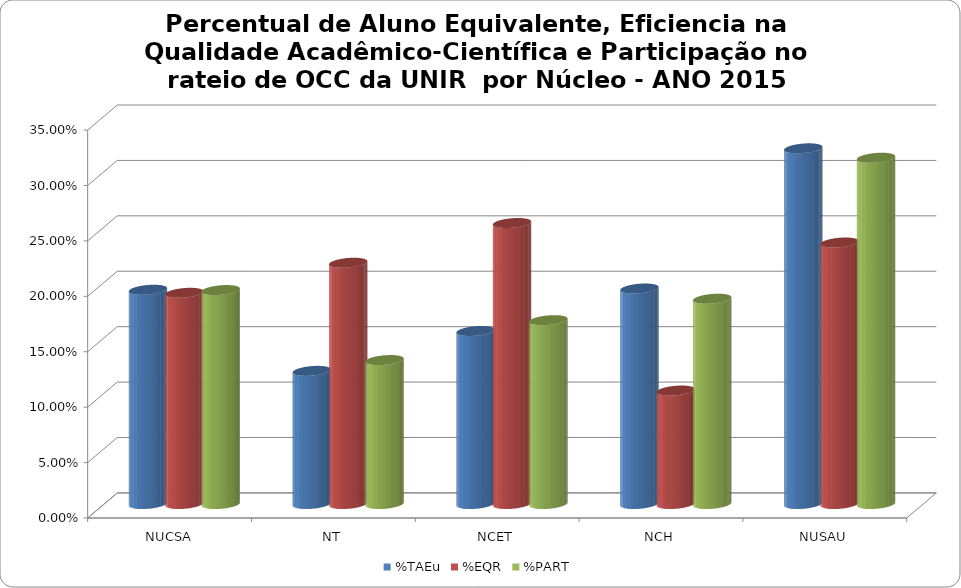
| Category | %TAEu | %EQR | %PART |
|---|---|---|---|
| NUCSA | 0.193 | 0.191 | 0.193 |
| NT | 0.12 | 0.218 | 0.13 |
| NCET | 0.156 | 0.254 | 0.166 |
| NCH | 0.194 | 0.102 | 0.185 |
| NUSAU | 0.321 | 0.236 | 0.312 |